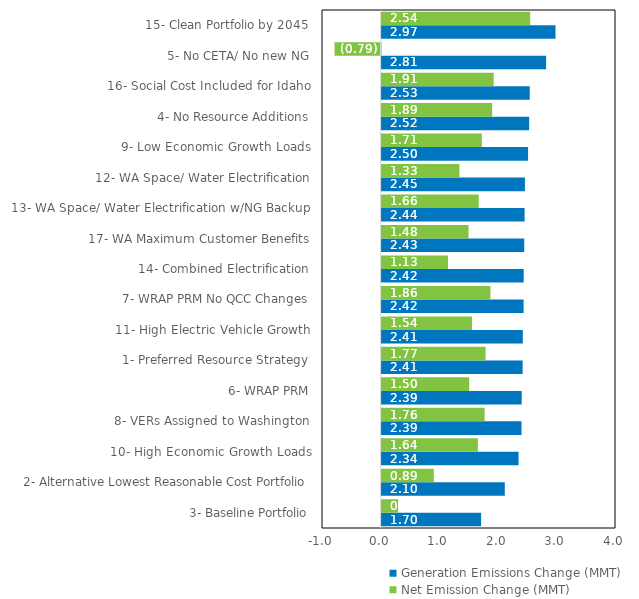
| Category | Generation Emissions Change (MMT) | Net Emission Change (MMT) |
|---|---|---|
| 3- Baseline Portfolio | 1.698 | 0.281 |
| 2- Alternative Lowest Reasonable Cost Portfolio | 2.102 | 0.891 |
| 10- High Economic Growth Loads | 2.337 | 1.643 |
| 8- VERs Assigned to Washington | 2.387 | 1.758 |
| 6- WRAP PRM | 2.391 | 1.495 |
| 1- Preferred Resource Strategy | 2.407 | 1.775 |
| 11- High Electric Vehicle Growth | 2.41 | 1.544 |
| 7- WRAP PRM No QCC Changes | 2.423 | 1.857 |
| 14- Combined Electrification | 2.425 | 1.133 |
| 17- WA Maximum Customer Benefits | 2.434 | 1.483 |
| 13- WA Space/ Water Electrification w/NG Backup | 2.44 | 1.657 |
| 12- WA Space/ Water Electrification | 2.446 | 1.328 |
| 9- Low Economic Growth Loads | 2.499 | 1.71 |
| 4- No Resource Additions | 2.518 | 1.886 |
| 16- Social Cost Included for Idaho | 2.528 | 1.912 |
| 5- No CETA/ No new NG | 2.807 | -0.786 |
| 15- Clean Portfolio by 2045 | 2.967 | 2.536 |